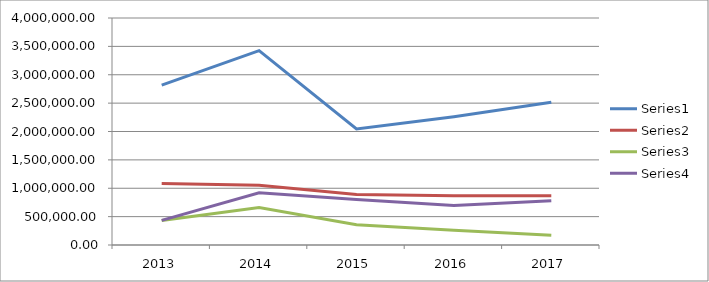
| Category | Series 0 | Series 1 | Series 2 | Series 3 |
|---|---|---|---|---|
| 2013.0 | 2815872.174 | 1083027.759 | 433211.104 | 433211.104 |
| 2014.0 | 3424085.775 | 1053564.854 | 658478.034 | 921869.247 |
| 2015.0 | 2046157.415 | 889633.659 | 355853.463 | 800670.293 |
| 2016.0 | 2260939.399 | 869592.077 | 260877.623 | 695673.661 |
| 2017.0 | 2513647.703 | 866775.07 | 173355.014 | 780097.563 |